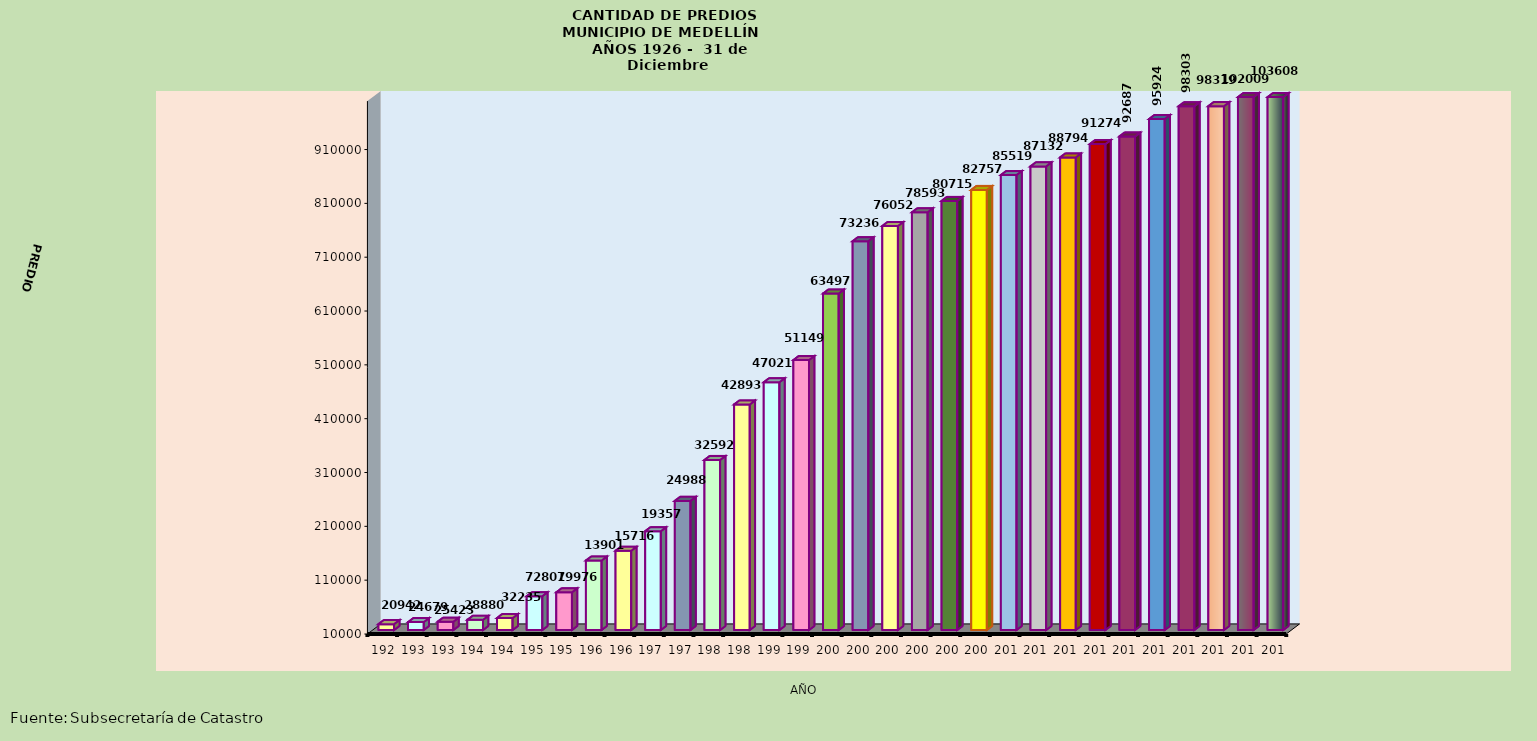
| Category | PREDIOS |
|---|---|
| 1926.0 | 20942 |
| 1930.0 | 24679 |
| 1935.0 | 25423 |
| 1940.0 | 28880 |
| 1945.0 | 32235 |
| 1950.0 | 72801 |
| 1955.0 | 79976 |
| 1960.0 | 139017 |
| 1965.0 | 157169 |
| 1970.0 | 193572 |
| 1975.0 | 249883 |
| 1980.0 | 325926 |
| 1985.0 | 428934 |
| 1990.0 | 470214 |
| 1995.0 | 511493 |
| 2000.0 | 634977 |
| 2005.0 | 732364 |
| 2006.0 | 760528 |
| 2007.0 | 785934 |
| 2008.0 | 807158 |
| 2009.0 | 827573 |
| 2010.0 | 855198 |
| 2011.0 | 871328 |
| 2012.0 | 887940 |
| 2013.0 | 912745 |
| 2014.0 | 926876 |
| 2015.0 | 959244 |
| 2016.0 | 983030 |
| 2017.0 | 983195 |
| 2018.0 | 1020091 |
| 2019.0 | 1036083 |